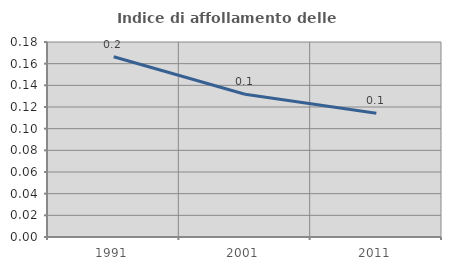
| Category | Indice di affollamento delle abitazioni  |
|---|---|
| 1991.0 | 0.166 |
| 2001.0 | 0.132 |
| 2011.0 | 0.114 |